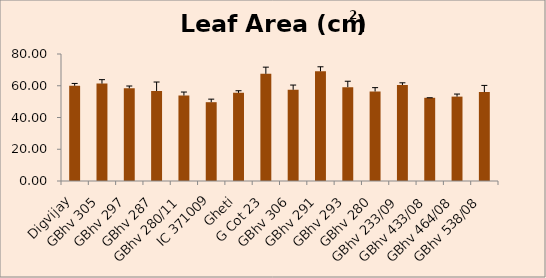
| Category | Leaf Area (cm2) |
|---|---|
| Digvijay | 59.985 |
| GBhv 305 | 61.344 |
| GBhv 297 | 58.381 |
| GBhv 287 | 56.718 |
| GBhv 280/11 | 53.812 |
| IC 371009 | 49.645 |
| Gheti | 55.525 |
| G Cot 23 | 67.492 |
| GBhv 306 | 57.459 |
| GBhv 291 | 69.102 |
| GBhv 293 | 59.128 |
| GBhv 280 | 56.39 |
| GBhv 233/09 | 60.464 |
| GBhv 433/08 | 52.415 |
| GBhv 464/08 | 53.148 |
| GBhv 538/08 | 55.996 |